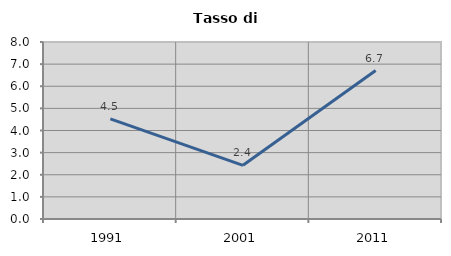
| Category | Tasso di disoccupazione   |
|---|---|
| 1991.0 | 4.527 |
| 2001.0 | 2.426 |
| 2011.0 | 6.709 |